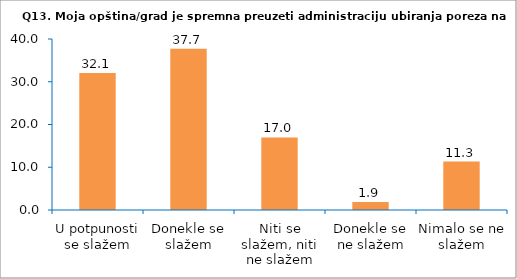
| Category | Series 0 |
|---|---|
| U potpunosti se slažem | 32.075 |
| Donekle se slažem | 37.736 |
| Niti se slažem, niti ne slažem | 16.981 |
| Donekle se ne slažem | 1.887 |
| Nimalo se ne slažem | 11.321 |